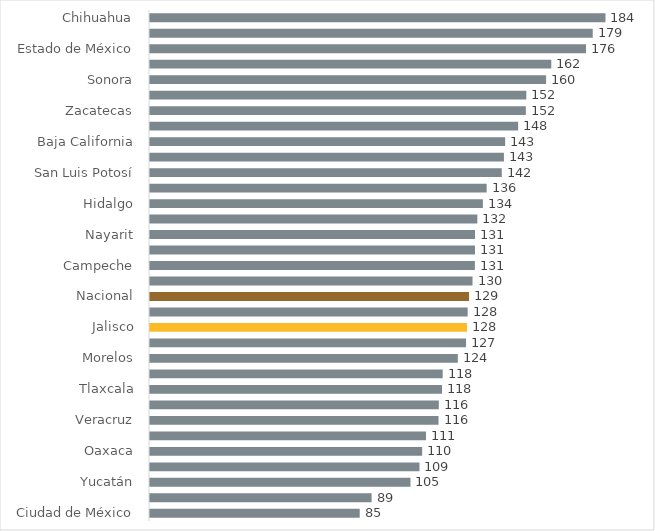
| Category | Series 0 |
|---|---|
| Ciudad de México | 84.561 |
| Quintana Roo | 89.356 |
| Yucatán | 105.036 |
| Tabasco | 108.667 |
| Oaxaca | 109.747 |
| Nuevo León | 111.289 |
| Veracruz | 116.346 |
| Querétaro | 116.45 |
| Tlaxcala | 117.759 |
| Puebla | 118.017 |
| Morelos | 124.128 |
| Chiapas | 127.441 |
| Jalisco | 127.81 |
| Aguascalientes | 128.076 |
| Nacional | 128.641 |
| Michoacán | 130.048 |
| Campeche | 131.001 |
| Sinaloa | 131.04 |
| Nayarit | 131.058 |
| Baja California Sur | 131.991 |
| Hidalgo | 134.223 |
| Coahuila | 135.746 |
| San Luis Potosí | 141.837 |
| Guanajuato | 142.713 |
| Baja California | 143.217 |
| Durango | 148.442 |
| Zacatecas | 151.545 |
| Guerrero | 151.741 |
| Sonora | 159.715 |
| Colima | 161.807 |
| Estado de México | 175.801 |
| Tamaulipas | 178.516 |
| Chihuahua | 183.659 |